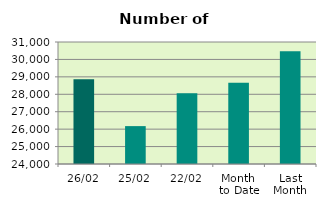
| Category | Series 0 |
|---|---|
| 26/02 | 28860 |
| 25/02 | 26174 |
| 22/02 | 28054 |
| Month 
to Date | 28669 |
| Last
Month | 30462.455 |